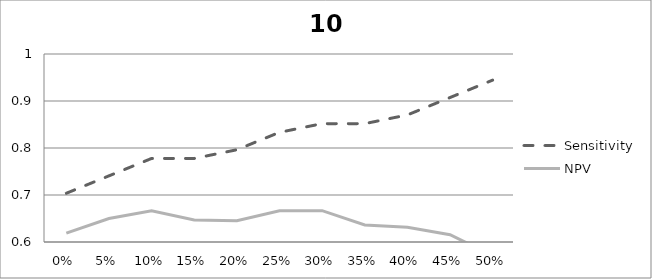
| Category | Sensitivity | NPV |
|---|---|---|
| 0.0 | 0.704 | 0.619 |
| 0.05 | 0.741 | 0.65 |
| 0.1 | 0.778 | 0.667 |
| 0.15 | 0.778 | 0.647 |
| 0.2 | 0.796 | 0.645 |
| 0.25 | 0.833 | 0.667 |
| 0.3 | 0.852 | 0.667 |
| 0.35 | 0.852 | 0.636 |
| 0.4 | 0.87 | 0.632 |
| 0.45 | 0.907 | 0.615 |
| 0.5 | 0.944 | 0.571 |